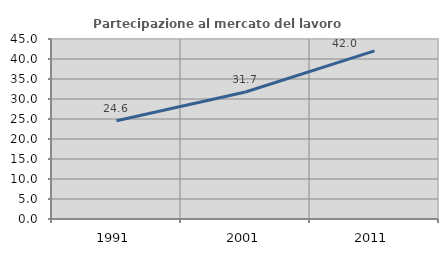
| Category | Partecipazione al mercato del lavoro  femminile |
|---|---|
| 1991.0 | 24.555 |
| 2001.0 | 31.746 |
| 2011.0 | 42.035 |